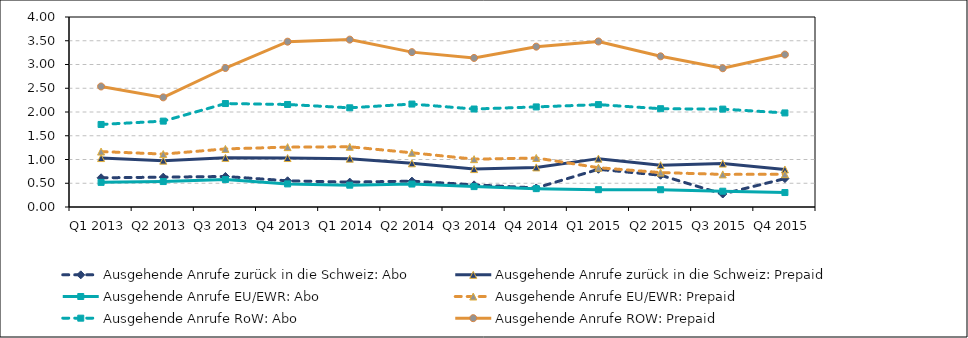
| Category | Ausgehende Anrufe zurück in die Schweiz: Abo | Ausgehende Anrufe zurück in die Schweiz: Prepaid | Ausgehende Anrufe EU/EWR: Abo | Ausgehende Anrufe EU/EWR: Prepaid | Ausgehende Anrufe RoW: Abo | Ausgehende Anrufe ROW: Prepaid |
|---|---|---|---|---|---|---|
| Q1 2013 | 0.615 | 1.031 | 0.518 | 1.167 | 1.738 | 2.537 |
| Q2 2013 | 0.628 | 0.976 | 0.536 | 1.114 | 1.808 | 2.308 |
| Q3 2013 | 0.643 | 1.034 | 0.577 | 1.223 | 2.178 | 2.926 |
| Q4 2013 | 0.552 | 1.031 | 0.486 | 1.26 | 2.158 | 3.48 |
| Q1 2014 | 0.524 | 1.018 | 0.459 | 1.268 | 2.088 | 3.524 |
| Q2 2014 | 0.545 | 0.92 | 0.483 | 1.141 | 2.167 | 3.26 |
| Q3 2014 | 0.467 | 0.798 | 0.429 | 1.007 | 2.063 | 3.138 |
| Q4 2014 | 0.401 | 0.834 | 0.386 | 1.032 | 2.107 | 3.376 |
| Q1 2015 | 0.794 | 1.018 | 0.365 | 0.827 | 2.156 | 3.485 |
| Q2 2015 | 0.669 | 0.881 | 0.364 | 0.725 | 2.069 | 3.172 |
| Q3 2015 | 0.274 | 0.914 | 0.332 | 0.686 | 2.061 | 2.921 |
| Q4 2015 | 0.598 | 0.79 | 0.304 | 0.69 | 1.981 | 3.21 |